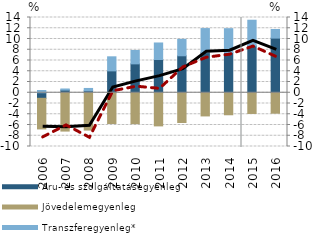
| Category | Áru- és szolgáltatásegyenleg | Jövedelemegyenleg | Transzferegyenleg* |
|---|---|---|---|
| 2006.0 | -1.031 | -5.7 | 0.418 |
| 2007.0 | 0.498 | -7.131 | 0.202 |
| 2008.0 | 0.36 | -6.946 | 0.439 |
| 2009.0 | 4.069 | -5.722 | 2.617 |
| 2010.0 | 5.375 | -5.752 | 2.492 |
| 2011.0 | 6.189 | -6.165 | 3.071 |
| 2012.0 | 6.879 | -5.533 | 3.049 |
| 2013.0 | 7.47 | -4.312 | 4.47 |
| 2014.0 | 7.468 | -4.096 | 4.454 |
| 2015.0 | 8.724 | -3.855 | 4.768 |
| 2016.0 | 10.167 | -3.803 | 1.598 |